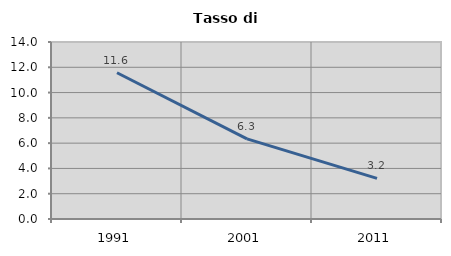
| Category | Tasso di disoccupazione   |
|---|---|
| 1991.0 | 11.567 |
| 2001.0 | 6.341 |
| 2011.0 | 3.209 |